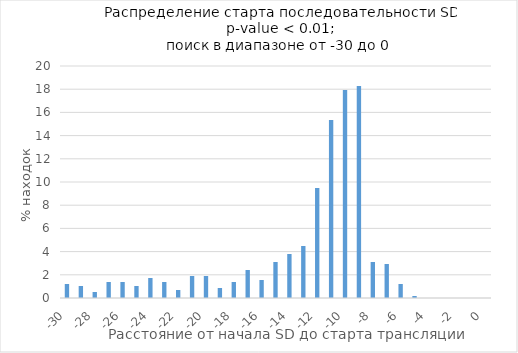
| Category | Series 0 |
|---|---|
| -30.0 | 1.207 |
| -29.0 | 1.034 |
| -28.0 | 0.517 |
| -27.0 | 1.379 |
| -26.0 | 1.379 |
| -25.0 | 1.034 |
| -24.0 | 1.724 |
| -23.0 | 1.379 |
| -22.0 | 0.69 |
| -21.0 | 1.897 |
| -20.0 | 1.897 |
| -19.0 | 0.862 |
| -18.0 | 1.379 |
| -17.0 | 2.414 |
| -16.0 | 1.552 |
| -15.0 | 3.103 |
| -14.0 | 3.793 |
| -13.0 | 4.483 |
| -12.0 | 9.483 |
| -11.0 | 15.345 |
| -10.0 | 17.931 |
| -9.0 | 18.276 |
| -8.0 | 3.103 |
| -7.0 | 2.931 |
| -6.0 | 1.207 |
| -5.0 | 0.172 |
| -4.0 | 0 |
| -3.0 | 0 |
| -2.0 | 0 |
| -1.0 | 0 |
| 0.0 | 0 |